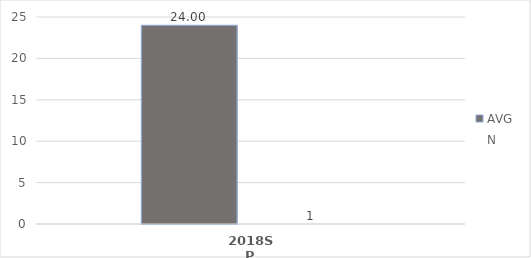
| Category | AVG | N |
|---|---|---|
| 2018SP | 24 | 1 |